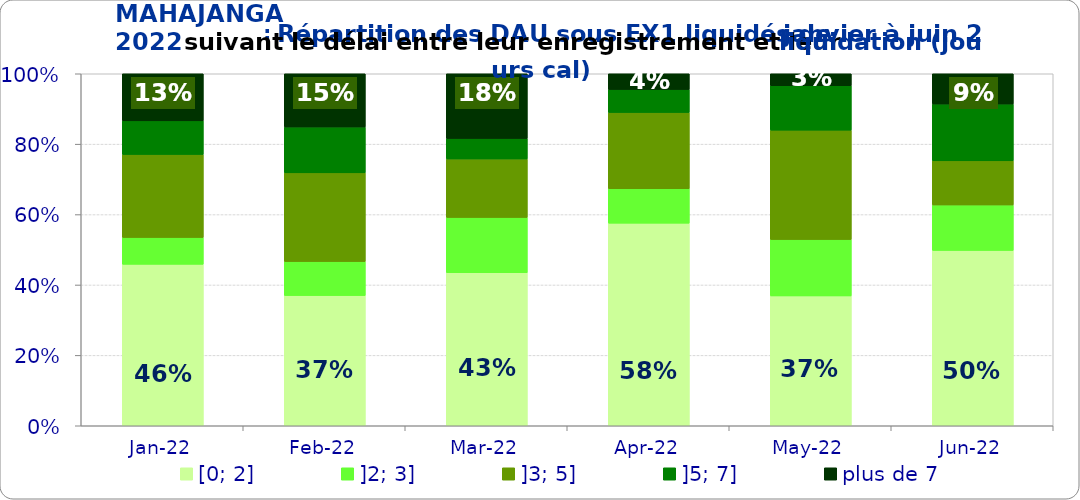
| Category | [0; 2] | ]2; 3] | ]3; 5] | ]5; 7] | plus de 7 |
|---|---|---|---|---|---|
| 2022-01-01 | 0.459 | 0.076 | 0.236 | 0.096 | 0.134 |
| 2022-02-01 | 0.37 | 0.097 | 0.252 | 0.13 | 0.151 |
| 2022-03-01 | 0.435 | 0.157 | 0.166 | 0.058 | 0.184 |
| 2022-04-01 | 0.576 | 0.098 | 0.216 | 0.065 | 0.045 |
| 2022-05-01 | 0.369 | 0.16 | 0.311 | 0.126 | 0.034 |
| 2022-06-01 | 0.498 | 0.129 | 0.125 | 0.161 | 0.086 |